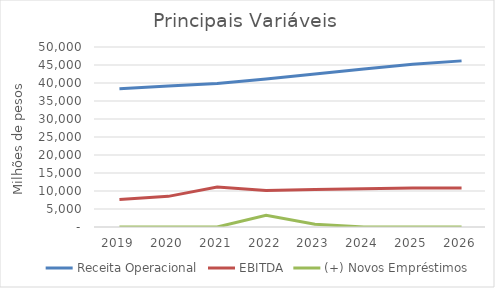
| Category | Receita Operacional | EBITDA | (+) Novos Empréstimos |
|---|---|---|---|
| 2019.0 | 38390799.111 | 7641369.607 | 0 |
| 2020.0 | 39173669.476 | 8510018.105 | 0 |
| 2021.0 | 39847271.852 | 11133006.333 | 0 |
| 2022.0 | 41106445.643 | 10152657.93 | 3232406.571 |
| 2023.0 | 42487622.217 | 10386542.828 | 772810.157 |
| 2024.0 | 43864221.176 | 10646983.13 | 0 |
| 2025.0 | 45219625.611 | 10823365.919 | 0 |
| 2026.0 | 46146627.936 | 10834295.914 | 0 |